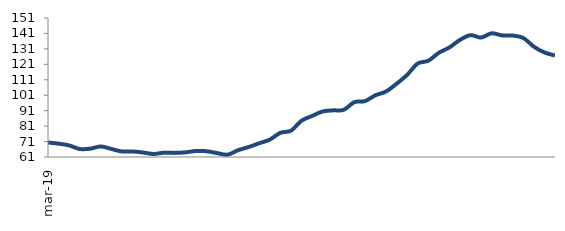
| Category | Series 0 |
|---|---|
| 2019-03-01 | 70.395 |
| 2019-04-01 | 69.635 |
| 2019-05-01 | 68.49 |
| 2019-06-01 | 66.189 |
| 2019-07-01 | 66.392 |
| 2019-08-01 | 67.837 |
| 2019-09-01 | 66.22 |
| 2019-10-01 | 64.573 |
| 2019-11-01 | 64.608 |
| 2019-12-01 | 63.908 |
| 2020-01-01 | 62.959 |
| 2020-02-01 | 63.811 |
| 2020-03-01 | 63.665 |
| 2020-04-01 | 64.013 |
| 2020-05-01 | 64.885 |
| 2020-06-01 | 64.73 |
| 2020-07-01 | 63.568 |
| 2020-08-01 | 62.507 |
| 2020-09-01 | 65.409 |
| 2020-10-01 | 67.466 |
| 2020-11-01 | 69.929 |
| 2020-12-01 | 72.262 |
| 2021-01-01 | 76.667 |
| 2021-02-01 | 78.05 |
| 2021-03-01 | 84.474 |
| 2021-04-01 | 87.564 |
| 2021-05-01 | 90.47 |
| 2021-06-01 | 91.204 |
| 2021-07-01 | 91.538 |
| 2021-08-01 | 96.497 |
| 2021-09-01 | 97.152 |
| 2021-10-01 | 100.957 |
| 2021-11-01 | 103.422 |
| 2021-12-01 | 108.432 |
| 2022-01-01 | 114.175 |
| 2022-02-01 | 121.528 |
| 2022-03-01 | 123.298 |
| 2022-04-01 | 128.467 |
| 2022-05-01 | 131.948 |
| 2022-06-01 | 136.827 |
| 2022-07-01 | 139.894 |
| 2022-08-01 | 138.341 |
| 2022-09-01 | 141.078 |
| 2022-10-01 | 139.73 |
| 2022-11-01 | 139.602 |
| 2022-12-01 | 138.086 |
| 2023-01-01 | 132.43 |
| 2023-02-01 | 128.69 |
| 2023-03-01 | 126.696 |